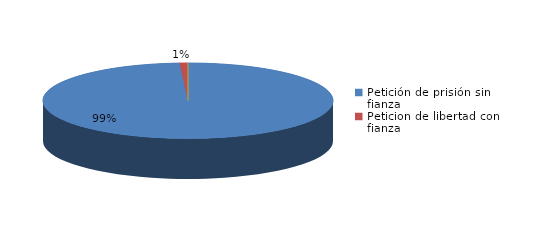
| Category | Series 0 |
|---|---|
| Petición de prisión sin fianza | 106 |
| Peticion de libertad con fianza | 1 |
| Petición de libertad | 0 |